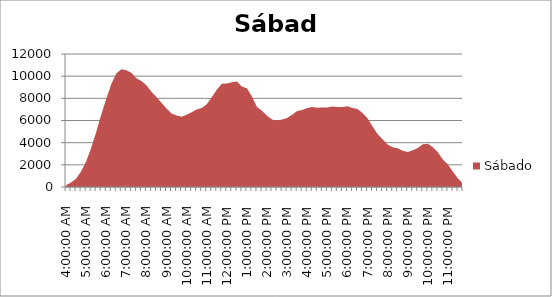
| Category | Sábado |
|---|---|
| 0.16666666666666663 | 157 |
| 0.1770833333333333 | 417 |
| 0.18749999999999994 | 747 |
| 0.1979166666666666 | 1388 |
| 0.20833333333333326 | 2297 |
| 0.21874999999999992 | 3520 |
| 0.22916666666666657 | 4939 |
| 0.23958333333333323 | 6516 |
| 0.2499999999999999 | 7944 |
| 0.2604166666666666 | 9280 |
| 0.27083333333333326 | 10250 |
| 0.28124999999999994 | 10617 |
| 0.29166666666666663 | 10527 |
| 0.3020833333333333 | 10317 |
| 0.3125 | 9821 |
| 0.3229166666666667 | 9553 |
| 0.33333333333333337 | 9181 |
| 0.34375000000000006 | 8603 |
| 0.35416666666666674 | 8128 |
| 0.3645833333333334 | 7607 |
| 0.3750000000000001 | 7075 |
| 0.3854166666666668 | 6642 |
| 0.3958333333333335 | 6455 |
| 0.40625000000000017 | 6345 |
| 0.41666666666666685 | 6528 |
| 0.42708333333333354 | 6754 |
| 0.4375000000000002 | 6992 |
| 0.4479166666666669 | 7137 |
| 0.4583333333333336 | 7472 |
| 0.4687500000000003 | 8109 |
| 0.47916666666666696 | 8767 |
| 0.48958333333333365 | 9316 |
| 0.5000000000000003 | 9340 |
| 0.510416666666667 | 9449 |
| 0.5208333333333336 | 9512 |
| 0.5312500000000002 | 9072 |
| 0.5416666666666669 | 8903 |
| 0.5520833333333335 | 8166 |
| 0.5625000000000001 | 7220 |
| 0.5729166666666667 | 6875 |
| 0.5833333333333334 | 6434 |
| 0.59375 | 6097 |
| 0.6041666666666666 | 6001 |
| 0.6145833333333333 | 6099 |
| 0.6249999999999999 | 6218 |
| 0.6354166666666665 | 6521 |
| 0.6458333333333331 | 6852 |
| 0.6562499999999998 | 6942 |
| 0.6666666666666664 | 7130 |
| 0.677083333333333 | 7208 |
| 0.6874999999999997 | 7155 |
| 0.6979166666666663 | 7169 |
| 0.7083333333333329 | 7184 |
| 0.7187499999999996 | 7265 |
| 0.7291666666666662 | 7220 |
| 0.7395833333333328 | 7228 |
| 0.7499999999999994 | 7288 |
| 0.7604166666666661 | 7119 |
| 0.7708333333333327 | 7032 |
| 0.7812499999999993 | 6678 |
| 0.791666666666666 | 6204 |
| 0.8020833333333326 | 5463 |
| 0.8124999999999992 | 4775 |
| 0.8229166666666659 | 4306 |
| 0.8333333333333325 | 3838 |
| 0.8437499999999991 | 3591 |
| 0.8541666666666657 | 3502 |
| 0.8645833333333324 | 3273 |
| 0.874999999999999 | 3150 |
| 0.8854166666666656 | 3309 |
| 0.8958333333333323 | 3512 |
| 0.9062499999999989 | 3855 |
| 0.9166666666666655 | 3895 |
| 0.9270833333333321 | 3582 |
| 0.9374999999999988 | 3134 |
| 0.9479166666666654 | 2472 |
| 0.958333333333332 | 2037 |
| 0.9687499999999987 | 1377 |
| 0.9791666666666653 | 770 |
| 0.9895833333333319 | 311 |